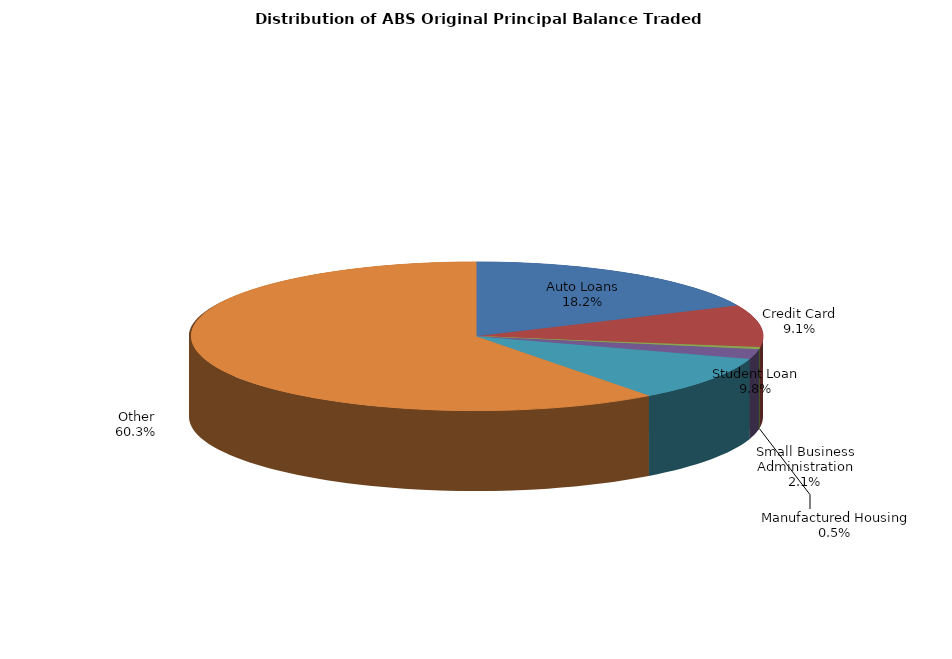
| Category | Series 0 |
|---|---|
| Auto Loans | 558013573.518 |
| Credit Card | 279756948.486 |
| Manufactured Housing | 13982830.347 |
| Small Business Administration | 65852371.625 |
| Student Loan | 300561854.97 |
| Other | 1848325881.252 |